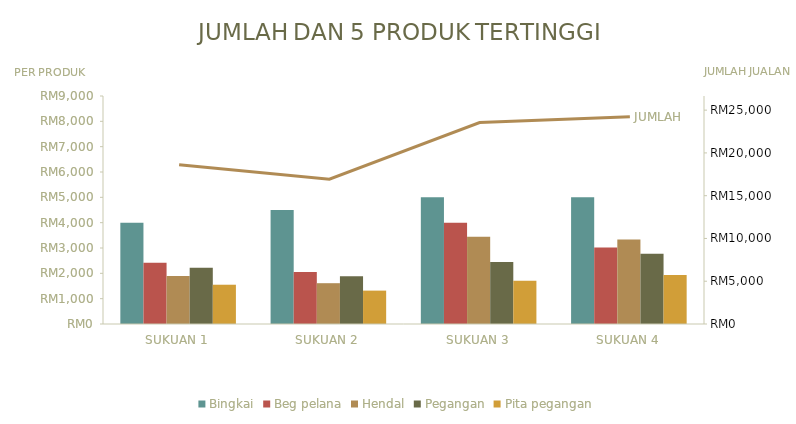
| Category | Bingkai | Beg pelana | Hendal | Pegangan | Pita pegangan |
|---|---|---|---|---|---|
| SUKUAN 1 | 4000 | 2413 | 1895 | 2222 | 1550.4 |
| SUKUAN 2 | 4500 | 2051.05 | 1610.75 | 1888.7 | 1317.84 |
| SUKUAN 3 | 5000 | 4000 | 3445 | 2444.2 | 1705.44 |
| SUKUAN 4 | 5000 | 3016.25 | 3333 | 2777.5 | 1938 |